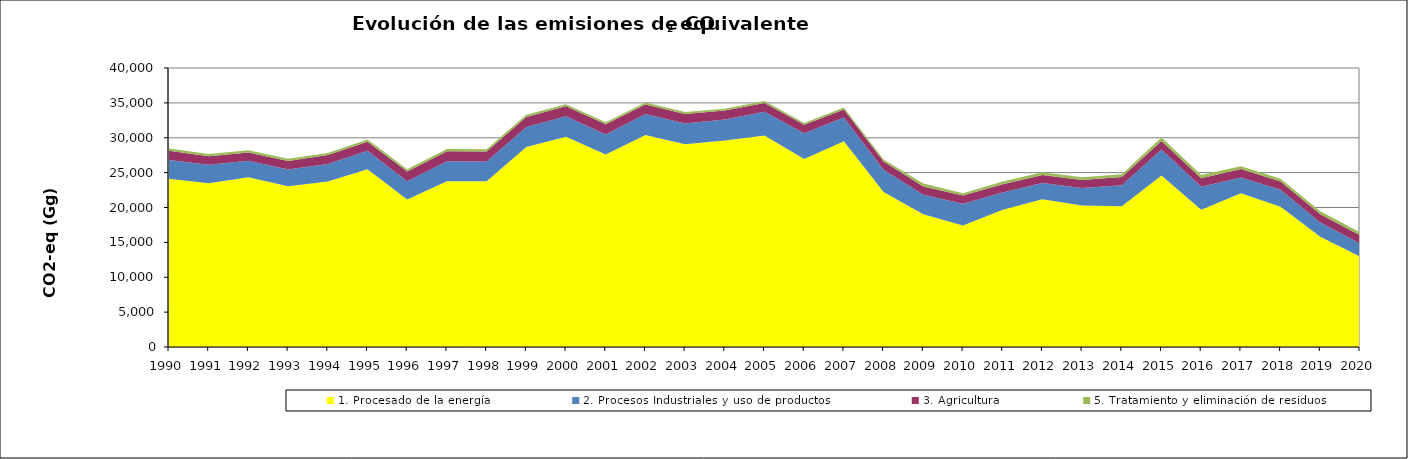
| Category | 1. Procesado de la energía | 2. Procesos Industriales y uso de productos | 3. Agricultura | 5. Tratamiento y eliminación de residuos |
|---|---|---|---|---|
| 1990.0 | 24110.098 | 2706.447 | 1327.1 | 307.853 |
| 1991.0 | 23476.975 | 2636.245 | 1239.228 | 300.194 |
| 1992.0 | 24348.096 | 2362.769 | 1172.926 | 320.757 |
| 1993.0 | 23055.248 | 2406.175 | 1219.475 | 315.377 |
| 1994.0 | 23717.515 | 2516.245 | 1276.642 | 314.785 |
| 1995.0 | 25469.274 | 2678.391 | 1291.109 | 314.775 |
| 1996.0 | 21138.135 | 2625.275 | 1408.689 | 313.12 |
| 1997.0 | 23749.127 | 2876.91 | 1434.033 | 327.027 |
| 1998.0 | 23765.641 | 2833.764 | 1431.271 | 333.698 |
| 1999.0 | 28687.21 | 2842.47 | 1444.462 | 330.207 |
| 2000.0 | 30131.137 | 2947.018 | 1425.869 | 301.132 |
| 2001.0 | 27584.423 | 2869.727 | 1480.16 | 292.882 |
| 2002.0 | 30380.87 | 3019.428 | 1370.826 | 293.578 |
| 2003.0 | 29079.123 | 2977.721 | 1337.637 | 310.644 |
| 2004.0 | 29618.338 | 2994.261 | 1278.723 | 280.876 |
| 2005.0 | 30336.757 | 3406.024 | 1243.462 | 276.012 |
| 2006.0 | 26961.211 | 3697.692 | 1191.788 | 277.684 |
| 2007.0 | 29513.161 | 3376.947 | 1175.677 | 285.402 |
| 2008.0 | 22214.08 | 3189.862 | 1180.156 | 283.747 |
| 2009.0 | 19022.782 | 2819.219 | 1166.068 | 426.198 |
| 2010.0 | 17434.897 | 3089.612 | 1189.531 | 313.507 |
| 2011.0 | 19663.889 | 2475.182 | 1182.383 | 398.328 |
| 2012.0 | 21169.985 | 2340.9 | 1163.133 | 396.385 |
| 2013.0 | 20279.378 | 2513.445 | 1150.238 | 379.455 |
| 2014.0 | 20172.617 | 3032.597 | 1177.266 | 387.59 |
| 2015.0 | 24596.618 | 3733.502 | 1208.95 | 482.982 |
| 2016.0 | 19667.333 | 3316.201 | 1216.969 | 465.043 |
| 2017.0 | 22028.299 | 2277.927 | 1196.168 | 397.534 |
| 2018.0 | 20118.678 | 2409.841 | 1194.431 | 403.039 |
| 2019.0 | 15805.312 | 2034.292 | 1190.873 | 422.279 |
| 2020.0 | 12982.211 | 1855.148 | 1197.508 | 419.173 |